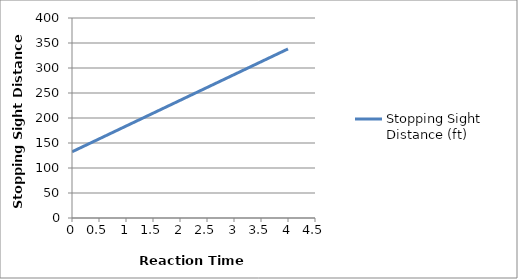
| Category | Stopping Sight Distance (ft) |
|---|---|
| 0.0 | 132.355 |
| 0.2 | 142.645 |
| 0.4 | 152.935 |
| 0.6 | 163.225 |
| 0.8 | 173.515 |
| 1.0 | 183.805 |
| 1.2 | 194.095 |
| 1.4 | 204.385 |
| 1.6 | 214.675 |
| 1.8 | 224.965 |
| 2.0 | 235.255 |
| 2.2 | 245.545 |
| 2.4 | 255.835 |
| 2.6 | 266.125 |
| 2.8 | 276.415 |
| 3.0 | 286.705 |
| 3.2 | 296.995 |
| 3.4 | 307.285 |
| 3.6 | 317.575 |
| 3.8 | 327.865 |
| 4.0 | 338.155 |